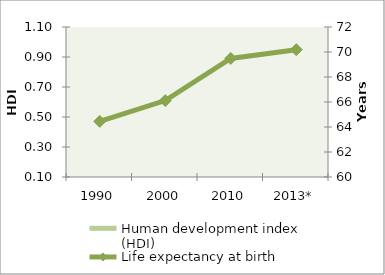
| Category | Human development index (HDI) |
|---|---|
| 1990 | 0 |
| 2000 | 0 |
| 2010 | 0 |
| 2013* | 0 |